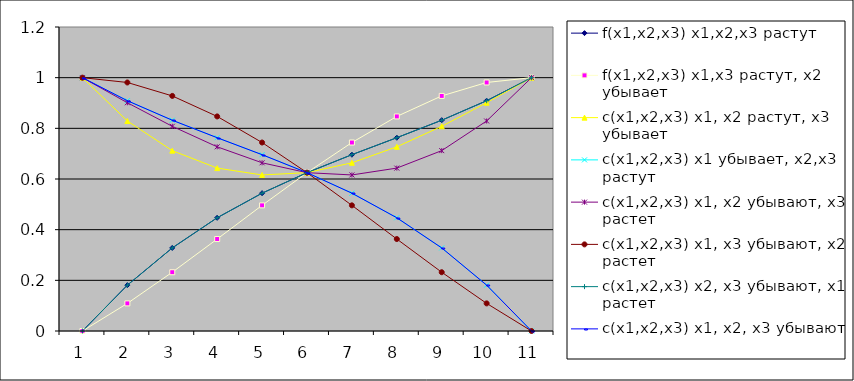
| Category | f(x1,x2,x3) x1,x2,x3 растут | f(x1,x2,x3) x1,x3 растут, x2 убывает | c(x1,x2,x3) x1, x2 растут, x3 убывает | c(x1,x2,x3) x1 убывает, x2,x3 растут | c(x1,x2,x3) x1, x2 убывают, x3 растет | c(x1,x2,x3) x1, x3 убывают, x2 растет | c(x1,x2,x3) x2, x3 убывают, x1 растет | c(x1,x2,x3) x1, x2, x3 убывают |
|---|---|---|---|---|---|---|---|---|
| 0 | 0 | 0 | 1 | 1 | 1 | 1 | 0 | 1 |
| 1 | 0.181 | 0.109 | 0.829 | 0.909 | 0.901 | 0.981 | 0.181 | 0.909 |
| 2 | 0.328 | 0.232 | 0.712 | 0.832 | 0.808 | 0.928 | 0.328 | 0.832 |
| 3 | 0.447 | 0.363 | 0.643 | 0.763 | 0.727 | 0.847 | 0.447 | 0.763 |
| 4 | 0.544 | 0.496 | 0.616 | 0.696 | 0.664 | 0.744 | 0.544 | 0.696 |
| 5 | 0.625 | 0.625 | 0.625 | 0.625 | 0.625 | 0.625 | 0.625 | 0.625 |
| 6 | 0.696 | 0.744 | 0.664 | 0.544 | 0.616 | 0.496 | 0.696 | 0.544 |
| 7 | 0.763 | 0.847 | 0.727 | 0.447 | 0.643 | 0.363 | 0.763 | 0.447 |
| 8 | 0.832 | 0.928 | 0.808 | 0.328 | 0.712 | 0.232 | 0.832 | 0.328 |
| 9 | 0.909 | 0.981 | 0.901 | 0.181 | 0.829 | 0.109 | 0.909 | 0.181 |
| 10 | 1 | 1 | 1 | 0 | 1 | 0 | 1 | 0 |